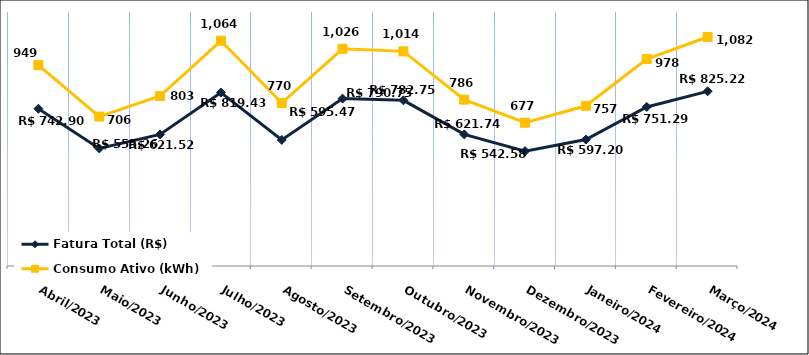
| Category | Fatura Total (R$) |
|---|---|
| Abril/2023 | 742.9 |
| Maio/2023 | 555.26 |
| Junho/2023 | 621.52 |
| Julho/2023 | 819.43 |
| Agosto/2023 | 595.47 |
| Setembro/2023 | 790.75 |
| Outubro/2023 | 782.75 |
| Novembro/2023 | 621.74 |
| Dezembro/2023 | 542.58 |
| Janeiro/2024 | 597.2 |
| Fevereiro/2024 | 751.29 |
| Março/2024 | 825.22 |